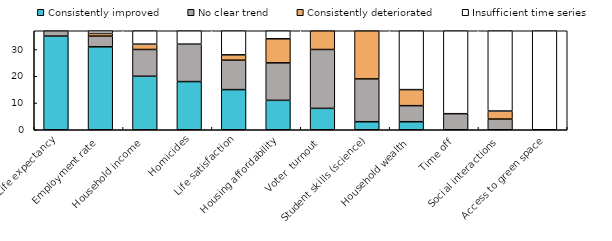
| Category | Consistently improved | No clear trend | Consistently deteriorated | Insufficient time series |
|---|---|---|---|---|
| Life expectancy | 35 | 2 | 0 | 0 |
| Employment rate | 31 | 4 | 1 | 1 |
| Household income | 20 | 10 | 2 | 5 |
| Homicides | 18 | 14 | 0 | 5 |
| Life satisfaction | 15 | 11 | 2 | 9 |
| Housing affordability | 11 | 14 | 9 | 3 |
| Voter  turnout | 8 | 22 | 7 | 0 |
| Student skills (science) | 3 | 16 | 18 | 0 |
| Household wealth | 3 | 6 | 6 | 22 |
| Time off | 0 | 6 | 0 | 31 |
| Social interactions | 0 | 4 | 3 | 30 |
| Access to green space | 0 | 0 | 0 | 37 |